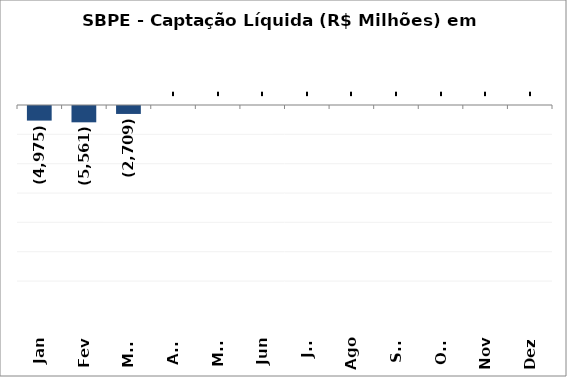
| Category | SBPE - Captação Líquida (R$ Milhões) em 2018 |
|---|---|
| Jan | -4974.781 |
| Fev | -5560.998 |
| Mar | -2708.602 |
| Abr | 0 |
| Mai | 0 |
| Jun | 0 |
| Jul | 0 |
| Ago | 0 |
| Set | 0 |
| Out | 0 |
| Nov | 0 |
| Dez | 0 |